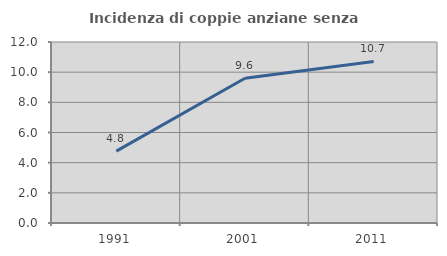
| Category | Incidenza di coppie anziane senza figli  |
|---|---|
| 1991.0 | 4.762 |
| 2001.0 | 9.6 |
| 2011.0 | 10.714 |